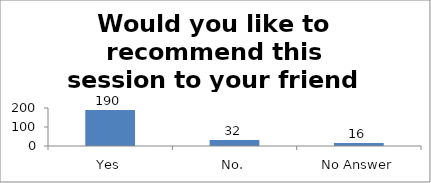
| Category | Would you like to recommend this session to your friend or colleague? |
|---|---|
| Yes | 190 |
| No. | 32 |
| No Answer | 16 |